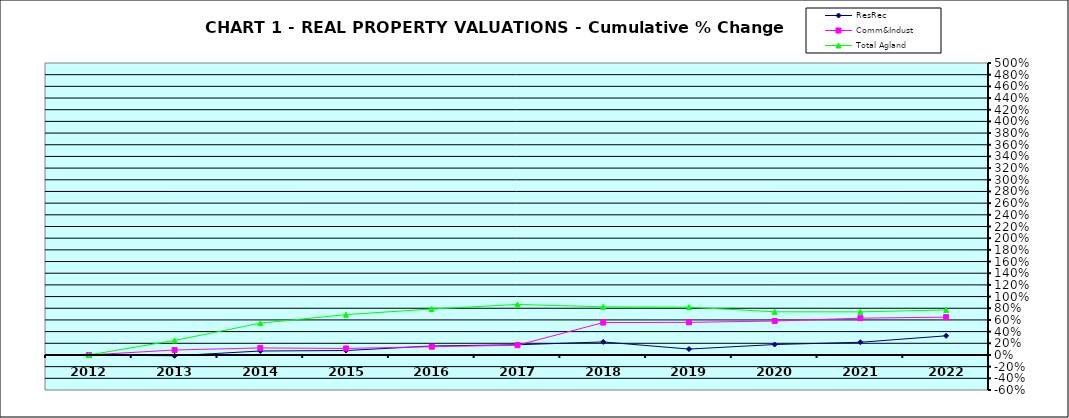
| Category | ResRec | Comm&Indust | Total Agland |
|---|---|---|---|
| 2012.0 | 0 | 0 | 0 |
| 2013.0 | -0.014 | 0.085 | 0.249 |
| 2014.0 | 0.068 | 0.12 | 0.544 |
| 2015.0 | 0.076 | 0.111 | 0.69 |
| 2016.0 | 0.154 | 0.141 | 0.787 |
| 2017.0 | 0.175 | 0.167 | 0.865 |
| 2018.0 | 0.223 | 0.555 | 0.825 |
| 2019.0 | 0.101 | 0.558 | 0.819 |
| 2020.0 | 0.179 | 0.581 | 0.739 |
| 2021.0 | 0.218 | 0.63 | 0.738 |
| 2022.0 | 0.328 | 0.648 | 0.772 |